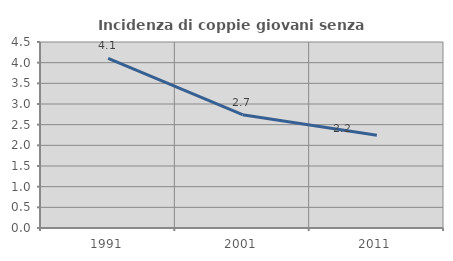
| Category | Incidenza di coppie giovani senza figli |
|---|---|
| 1991.0 | 4.102 |
| 2001.0 | 2.741 |
| 2011.0 | 2.242 |